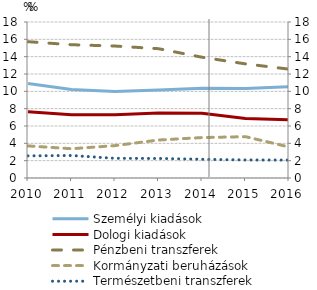
| Category | Személyi kiadások  | Dologi kiadások  | Pénzbeni transzferek | Kormányzati beruházások |
|---|---|---|---|---|
| 2010.0 | 10.896 | 7.65 | 15.728 | 3.703 |
| 2011.0 | 10.225 | 7.294 | 15.378 | 3.377 |
| 2012.0 | 9.981 | 7.286 | 15.226 | 3.736 |
| 2013.0 | 10.146 | 7.496 | 14.921 | 4.382 |
| 2014.0 | 10.347 | 7.458 | 13.936 | 4.666 |
| 2015.0 | 10.322 | 6.873 | 13.167 | 4.769 |
| 2016.0 | 10.545 | 6.729 | 12.56 | 3.58 |